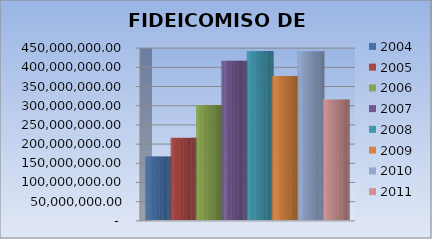
| Category | 2004 | 2005 | 2006 | 2007 | 2008 | 2009 | 2010 | 2011 |
|---|---|---|---|---|---|---|---|---|
| 0 | 165497169.85 | 213985507.51 | 299665050.25 | 414880697.25 | 440032303.95 | 375381457.45 | 439508500.565 | 313723447.28 |